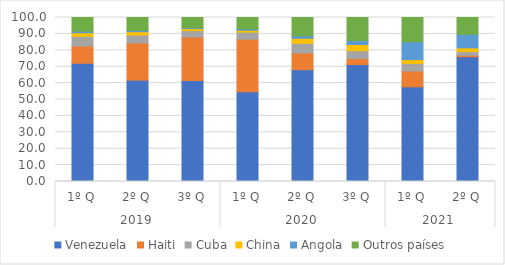
| Category | Venezuela | Haiti | Cuba | China | Angola | Outros países |
|---|---|---|---|---|---|---|
| 0 | 72.108 | 10.449 | 5.932 | 2.206 | 0.964 | 8.341 |
| 1 | 61.821 | 22.643 | 4.866 | 1.996 | 0.758 | 7.916 |
| 2 | 61.641 | 26.452 | 3.874 | 1.28 | 0.504 | 6.248 |
| 3 | 54.756 | 31.956 | 4.362 | 1.145 | 0.804 | 6.977 |
| 4 | 68.206 | 10.158 | 5.937 | 3.008 | 1.478 | 11.214 |
| 5 | 71.356 | 3.6 | 4.784 | 3.774 | 2.4 | 14.085 |
| 6 | 57.719 | 9.668 | 4.636 | 2.318 | 10.854 | 14.805 |
| 7 | 76.102 | 0.876 | 2.25 | 2.263 | 8.28 | 10.229 |